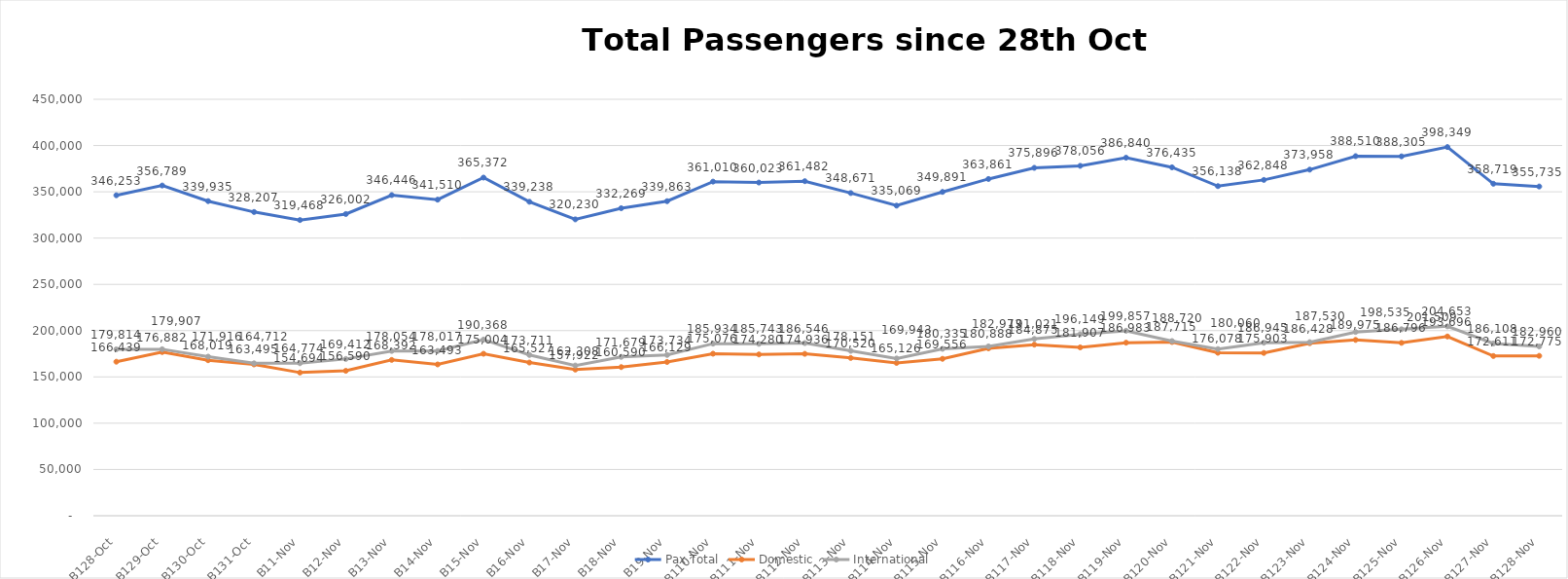
| Category | Pax Total | Domestic | International |
|---|---|---|---|
| 2023-10-28 | 346253 | 166439 | 179814 |
| 2023-10-29 | 356789 | 176882 | 179907 |
| 2023-10-30 | 339935 | 168019 | 171916 |
| 2023-10-31 | 328207 | 163495 | 164712 |
| 2023-11-01 | 319468 | 154694 | 164774 |
| 2023-11-02 | 326002 | 156590 | 169412 |
| 2023-11-03 | 346446 | 168392 | 178054 |
| 2023-11-04 | 341510 | 163493 | 178017 |
| 2023-11-05 | 365372 | 175004 | 190368 |
| 2023-11-06 | 339238 | 165527 | 173711 |
| 2023-11-07 | 320230 | 157922 | 162308 |
| 2023-11-08 | 332269 | 160590 | 171679 |
| 2023-11-09 | 339863 | 166129 | 173734 |
| 2023-11-10 | 361010 | 175076 | 185934 |
| 2023-11-11 | 360023 | 174280 | 185743 |
| 2023-11-12 | 361482 | 174936 | 186546 |
| 2023-11-13 | 348671 | 170520 | 178151 |
| 2023-11-14 | 335069 | 165126 | 169943 |
| 2023-11-15 | 349891 | 169556 | 180335 |
| 2023-11-16 | 363861 | 180888 | 182973 |
| 2023-11-17 | 375896 | 184875 | 191021 |
| 2023-11-18 | 378056 | 181907 | 196149 |
| 2023-11-19 | 386840 | 186983 | 199857 |
| 2023-11-20 | 376435 | 187715 | 188720 |
| 2023-11-21 | 356138 | 176078 | 180060 |
| 2023-11-22 | 362848 | 175903 | 186945 |
| 2023-11-23 | 373958 | 186428 | 187530 |
| 2023-11-24 | 388510 | 189975 | 198535 |
| 2023-11-25 | 388305 | 186796 | 201509 |
| 2023-11-26 | 398349 | 193696 | 204653 |
| 2023-11-27 | 358719 | 172611 | 186108 |
| 2023-11-28 | 355735 | 172775 | 182960 |